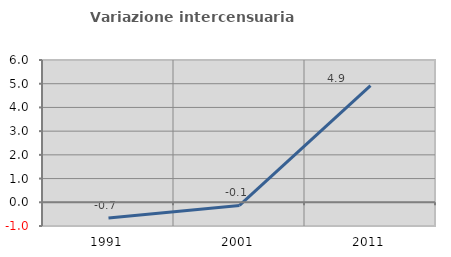
| Category | Variazione intercensuaria annua |
|---|---|
| 1991.0 | -0.658 |
| 2001.0 | -0.133 |
| 2011.0 | 4.917 |